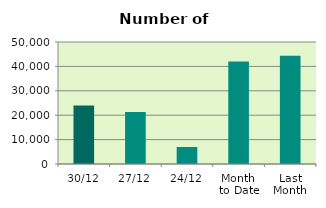
| Category | Series 0 |
|---|---|
| 30/12 | 23968 |
| 27/12 | 21292 |
| 24/12 | 6964 |
| Month 
to Date | 41996.211 |
| Last
Month | 44331.238 |